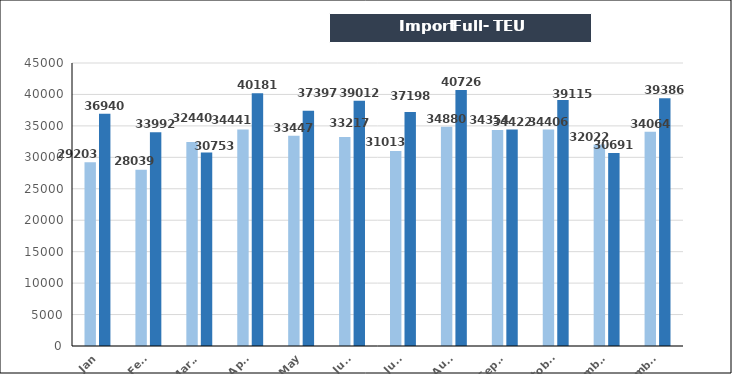
| Category | TEU |
|---|---|
| Jan | 36940 |
| Feb. | 33992 |
| March | 30753 |
| April | 40181 |
| May | 37397 |
| June | 39012 |
| July | 37198 |
| Aug. | 40726 |
| Sept. | 34422 |
| October | 39115 |
| November | 30691 |
| December | 39386 |